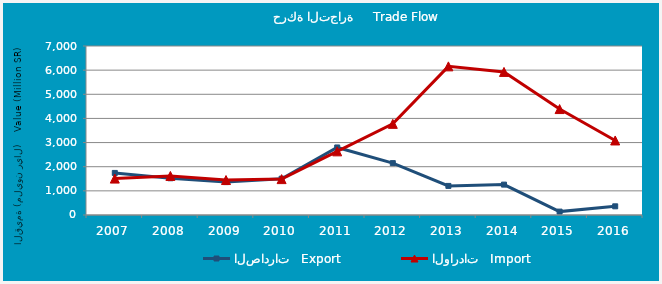
| Category | الصادرات   Export | الواردات   Import |
|---|---|---|
| 2007.0 | 1742.742 | 1508.39 |
| 2008.0 | 1521.696 | 1618.095 |
| 2009.0 | 1363.6 | 1448.325 |
| 2010.0 | 1502.528 | 1486.227 |
| 2011.0 | 2797.716 | 2636.346 |
| 2012.0 | 2149.008 | 3774.731 |
| 2013.0 | 1204.835 | 6156.317 |
| 2014.0 | 1258.546 | 5926.371 |
| 2015.0 | 140.857 | 4387.352 |
| 2016.0 | 359.237 | 3087.137 |